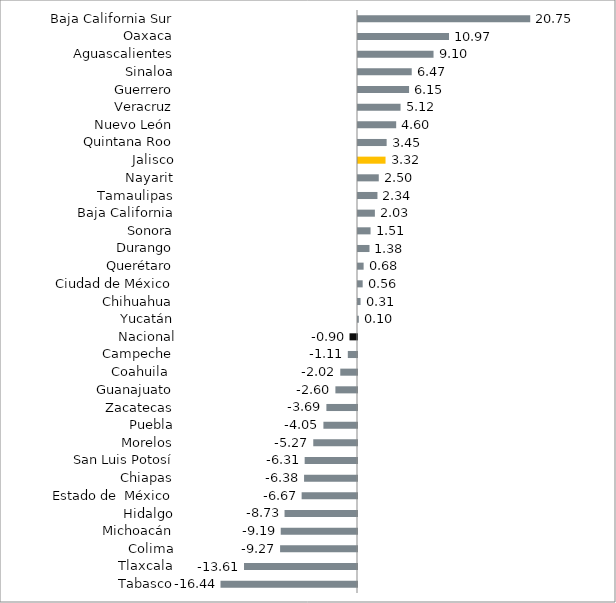
| Category | Series 0 |
|---|---|
|           Tabasco | -16.444 |
|           Tlaxcala | -13.613 |
|           Colima | -9.267 |
|           Michoacán | -9.19 |
|           Hidalgo | -8.73 |
|          Estado de  México | -6.67 |
|           Chiapas | -6.378 |
|           San Luis Potosí | -6.305 |
|           Morelos | -5.269 |
|           Puebla | -4.046 |
|           Zacatecas | -3.688 |
|           Guanajuato | -2.603 |
|           Coahuila  | -2.015 |
|           Campeche | -1.107 |
| Nacional | -0.902 |
|           Yucatán | 0.099 |
|           Chihuahua | 0.307 |
|           Ciudad de México | 0.563 |
|           Querétaro | 0.677 |
|           Durango | 1.385 |
|           Sonora | 1.512 |
|           Baja California | 2.035 |
|           Tamaulipas | 2.343 |
|           Nayarit | 2.503 |
|           Jalisco | 3.318 |
|           Quintana Roo | 3.451 |
|           Nuevo León | 4.6 |
|           Veracruz | 5.125 |
|           Guerrero | 6.152 |
|           Sinaloa | 6.473 |
|           Aguascalientes | 9.099 |
|           Oaxaca | 10.966 |
|           Baja California Sur | 20.749 |